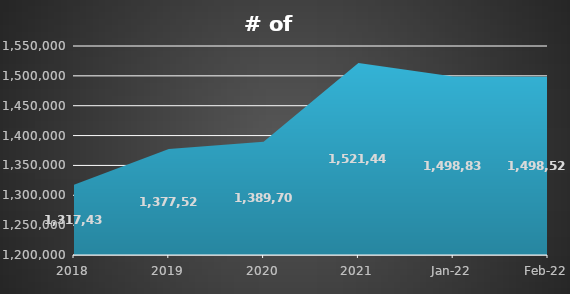
| Category | # of producers* |
|---|---|
| 2018.0 | 1317435 |
| 2019.0 | 1377528 |
| 2020.0 | 1389702 |
| 2021.0 | 1521444 |
| 44592.0 | 1498834 |
| 44620.0 | 1498521 |